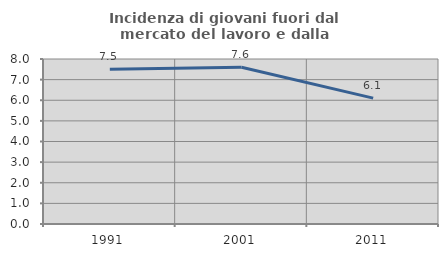
| Category | Incidenza di giovani fuori dal mercato del lavoro e dalla formazione  |
|---|---|
| 1991.0 | 7.502 |
| 2001.0 | 7.604 |
| 2011.0 | 6.105 |